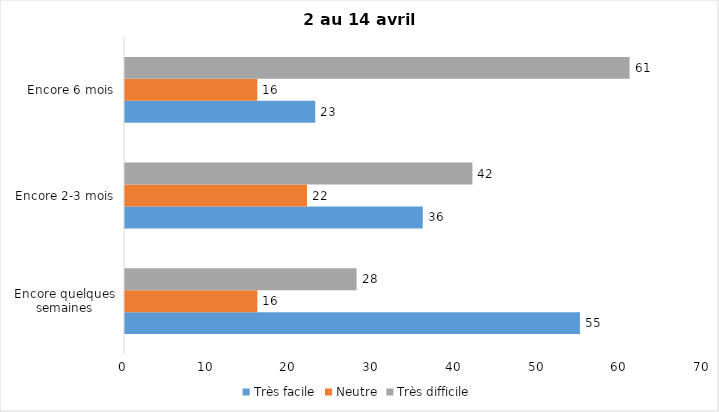
| Category | Très facile | Neutre | Très difficile |
|---|---|---|---|
| Encore quelques semaines | 55 | 16 | 28 |
| Encore 2-3 mois | 36 | 22 | 42 |
| Encore 6 mois | 23 | 16 | 61 |